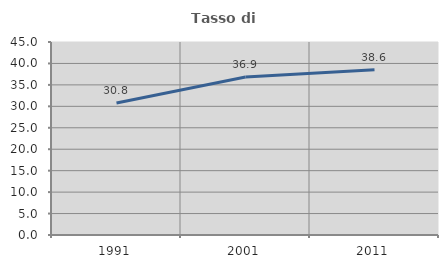
| Category | Tasso di occupazione   |
|---|---|
| 1991.0 | 30.788 |
| 2001.0 | 36.854 |
| 2011.0 | 38.557 |